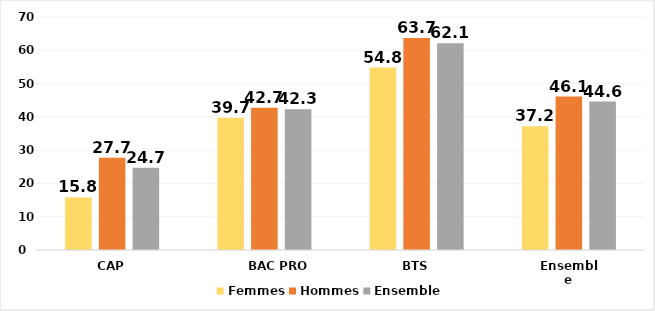
| Category | Femmes | Hommes | Ensemble |
|---|---|---|---|
| CAP | 15.8 | 27.7 | 24.7 |
| BAC PRO | 39.7 | 42.7 | 42.3 |
| BTS | 54.8 | 63.7 | 62.1 |
| Ensemble | 37.2 | 46.1 | 44.6 |